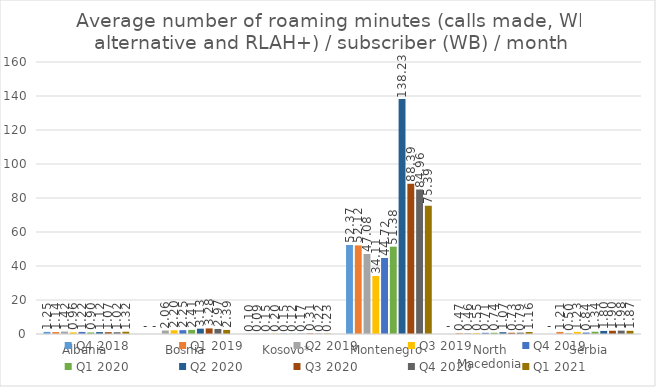
| Category | Q4 2018 | Q1 2019 | Q2 2019 | Q3 2019 | Q4 2019 | Q1 2020 | Q2 2020 | Q3 2020 | Q4 2020 | Q1 2021 |
|---|---|---|---|---|---|---|---|---|---|---|
| Albania | 1.247 | 1.14 | 1.416 | 0.965 | 1.224 | 0.903 | 1.121 | 1.068 | 1.021 | 1.324 |
| Bosnia | 0 | 0 | 2.059 | 2.197 | 2.25 | 2.407 | 3.128 | 3.278 | 2.973 | 2.394 |
| Kosovo* | 0.099 | 0.086 | 0.146 | 0.203 | 0.153 | 0.123 | 0.172 | 0.309 | 0.217 | 0.23 |
| Montenegro | 52.373 | 52.12 | 47.079 | 34.11 | 44.719 | 51.377 | 138.229 | 88.388 | 84.963 | 75.39 |
| North Macedonia | 0 | 0.47 | 0.464 | 0.547 | 0.705 | 0.737 | 1.066 | 0.733 | 0.791 | 1.159 |
| Serbia | 0 | 1.214 | 0.496 | 1.228 | 0.844 | 1.338 | 1.802 | 1.902 | 1.985 | 1.87 |